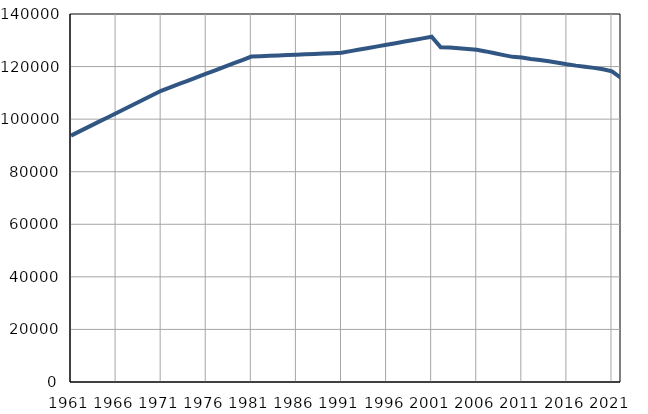
| Category | Population
size |
|---|---|
| 1961.0 | 93744 |
| 1962.0 | 95448 |
| 1963.0 | 97151 |
| 1964.0 | 98855 |
| 1965.0 | 100558 |
| 1966.0 | 102262 |
| 1967.0 | 103966 |
| 1968.0 | 105669 |
| 1969.0 | 107373 |
| 1970.0 | 109076 |
| 1971.0 | 110780 |
| 1972.0 | 112081 |
| 1973.0 | 113382 |
| 1974.0 | 114683 |
| 1975.0 | 115984 |
| 1976.0 | 117285 |
| 1977.0 | 118587 |
| 1978.0 | 119888 |
| 1979.0 | 121189 |
| 1980.0 | 122490 |
| 1981.0 | 123791 |
| 1982.0 | 123938 |
| 1983.0 | 124085 |
| 1984.0 | 124232 |
| 1985.0 | 124379 |
| 1986.0 | 124526 |
| 1987.0 | 124672 |
| 1988.0 | 124820 |
| 1989.0 | 124967 |
| 1990.0 | 125113 |
| 1991.0 | 125261 |
| 1992.0 | 125868 |
| 1993.0 | 126475 |
| 1994.0 | 127082 |
| 1995.0 | 127689 |
| 1996.0 | 128296 |
| 1997.0 | 128903 |
| 1998.0 | 129510 |
| 1999.0 | 130117 |
| 2000.0 | 130724 |
| 2001.0 | 131331 |
| 2002.0 | 127296 |
| 2003.0 | 127210 |
| 2004.0 | 126960 |
| 2005.0 | 126716 |
| 2006.0 | 126388 |
| 2007.0 | 125769 |
| 2008.0 | 125038 |
| 2009.0 | 124362 |
| 2010.0 | 123700 |
| 2011.0 | 123445 |
| 2012.0 | 122916 |
| 2013.0 | 122492 |
| 2014.0 | 122013 |
| 2015.0 | 121482 |
| 2016.0 | 120871 |
| 2017.0 | 120361 |
| 2018.0 | 119960 |
| 2019.0 | 119509 |
| 2020.0 | 118971 |
| 2021.0 | 118163 |
| 2022.0 | 115664 |